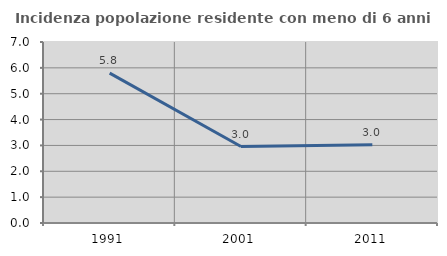
| Category | Incidenza popolazione residente con meno di 6 anni |
|---|---|
| 1991.0 | 5.797 |
| 2001.0 | 2.957 |
| 2011.0 | 3.03 |